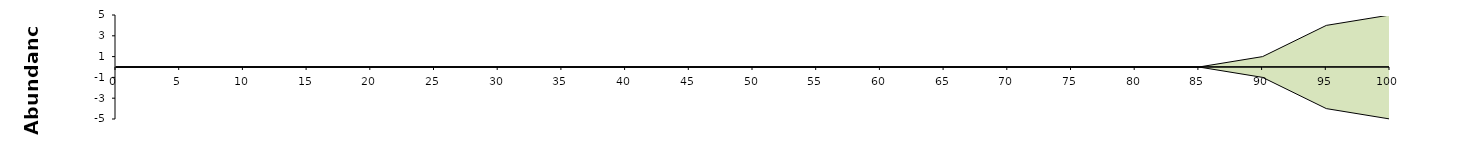
| Category | Series1 | Series2 |
|---|---|---|
| 0.0 | 0 | 0 |
| 5.0 | 0 | 0 |
| 10.0 | 0 | 0 |
| 15.0 | 0 | 0 |
| 20.0 | 0 | 0 |
| 25.0 | 0 | 0 |
| 30.0 | 0 | 0 |
| 35.0 | 0 | 0 |
| 40.0 | 0 | 0 |
| 45.0 | 0 | 0 |
| 50.0 | 0 | 0 |
| 55.0 | 0 | 0 |
| 60.0 | 0 | 0 |
| 65.0 | 0 | 0 |
| 70.0 | 0 | 0 |
| 75.0 | 0 | 0 |
| 80.0 | 0 | 0 |
| 85.0 | 0 | 0 |
| 90.0 | 1 | -1 |
| 95.0 | 4 | -4 |
| 100.0 | 5 | -5 |